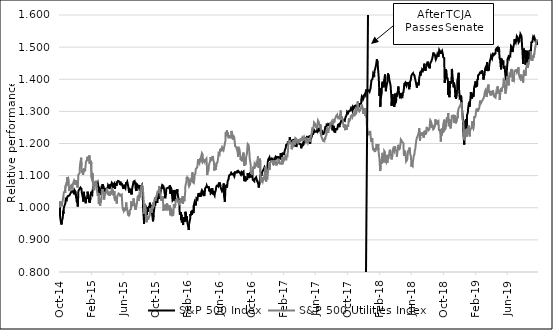
| Category | S&P 500 Index | S&P 500 Utilities Index |
|---|---|---|
| 2014-10-06 | 1 | 1 |
| 2014-10-07 | 0.985 | 0.999 |
| 2014-10-08 | 1.002 | 1.021 |
| 2014-10-09 | 0.981 | 1.004 |
| 2014-10-10 | 0.97 | 1.009 |
| 2014-10-13 | 0.954 | 1.009 |
| 2014-10-14 | 0.956 | 1.018 |
| 2014-10-15 | 0.948 | 1.005 |
| 2014-10-16 | 0.948 | 1.005 |
| 2014-10-17 | 0.96 | 1.011 |
| 2014-10-20 | 0.969 | 1.025 |
| 2014-10-21 | 0.988 | 1.029 |
| 2014-10-22 | 0.981 | 1.035 |
| 2014-10-23 | 0.993 | 1.037 |
| 2014-10-24 | 1 | 1.047 |
| 2014-10-27 | 0.998 | 1.045 |
| 2014-10-28 | 1.01 | 1.053 |
| 2014-10-29 | 1.009 | 1.046 |
| 2014-10-30 | 1.015 | 1.068 |
| 2014-10-31 | 1.027 | 1.068 |
| 2014-11-03 | 1.027 | 1.076 |
| 2014-11-04 | 1.024 | 1.069 |
| 2014-11-05 | 1.03 | 1.094 |
| 2014-11-06 | 1.034 | 1.074 |
| 2014-11-07 | 1.034 | 1.085 |
| 2014-11-10 | 1.037 | 1.091 |
| 2014-11-11 | 1.038 | 1.087 |
| 2014-11-12 | 1.037 | 1.065 |
| 2014-11-13 | 1.038 | 1.056 |
| 2014-11-14 | 1.038 | 1.052 |
| 2014-11-17 | 1.039 | 1.066 |
| 2014-11-18 | 1.044 | 1.069 |
| 2014-11-19 | 1.043 | 1.068 |
| 2014-11-20 | 1.045 | 1.066 |
| 2014-11-21 | 1.05 | 1.07 |
| 2014-11-24 | 1.053 | 1.06 |
| 2014-11-25 | 1.052 | 1.059 |
| 2014-11-26 | 1.055 | 1.065 |
| 2014-11-27 | 1.055 | 1.065 |
| 2014-11-28 | 1.052 | 1.076 |
| 2014-12-01 | 1.045 | 1.078 |
| 2014-12-02 | 1.052 | 1.085 |
| 2014-12-03 | 1.056 | 1.082 |
| 2014-12-04 | 1.055 | 1.081 |
| 2014-12-05 | 1.056 | 1.072 |
| 2014-12-08 | 1.049 | 1.08 |
| 2014-12-09 | 1.048 | 1.085 |
| 2014-12-10 | 1.031 | 1.072 |
| 2014-12-11 | 1.036 | 1.083 |
| 2014-12-12 | 1.019 | 1.072 |
| 2014-12-15 | 1.013 | 1.063 |
| 2014-12-16 | 1.004 | 1.061 |
| 2014-12-17 | 1.024 | 1.081 |
| 2014-12-18 | 1.049 | 1.102 |
| 2014-12-19 | 1.054 | 1.103 |
| 2014-12-22 | 1.058 | 1.106 |
| 2014-12-23 | 1.06 | 1.109 |
| 2014-12-24 | 1.06 | 1.129 |
| 2014-12-25 | 1.06 | 1.129 |
| 2014-12-26 | 1.063 | 1.143 |
| 2014-12-29 | 1.064 | 1.156 |
| 2014-12-30 | 1.059 | 1.132 |
| 2014-12-31 | 1.048 | 1.111 |
| 2015-01-01 | 1.048 | 1.111 |
| 2015-01-02 | 1.048 | 1.117 |
| 2015-01-05 | 1.028 | 1.102 |
| 2015-01-06 | 1.019 | 1.104 |
| 2015-01-07 | 1.031 | 1.115 |
| 2015-01-08 | 1.05 | 1.122 |
| 2015-01-09 | 1.041 | 1.115 |
| 2015-01-12 | 1.032 | 1.112 |
| 2015-01-13 | 1.03 | 1.116 |
| 2015-01-14 | 1.024 | 1.126 |
| 2015-01-15 | 1.014 | 1.134 |
| 2015-01-16 | 1.028 | 1.144 |
| 2015-01-19 | 1.028 | 1.144 |
| 2015-01-20 | 1.029 | 1.147 |
| 2015-01-21 | 1.034 | 1.158 |
| 2015-01-22 | 1.05 | 1.153 |
| 2015-01-23 | 1.044 | 1.157 |
| 2015-01-26 | 1.047 | 1.157 |
| 2015-01-27 | 1.033 | 1.158 |
| 2015-01-28 | 1.019 | 1.148 |
| 2015-01-29 | 1.029 | 1.163 |
| 2015-01-30 | 1.015 | 1.137 |
| 2015-02-02 | 1.029 | 1.142 |
| 2015-02-03 | 1.043 | 1.147 |
| 2015-02-04 | 1.039 | 1.132 |
| 2015-02-05 | 1.05 | 1.142 |
| 2015-02-06 | 1.046 | 1.094 |
| 2015-02-09 | 1.042 | 1.085 |
| 2015-02-10 | 1.053 | 1.107 |
| 2015-02-11 | 1.053 | 1.081 |
| 2015-02-12 | 1.063 | 1.075 |
| 2015-02-13 | 1.067 | 1.058 |
| 2015-02-16 | 1.067 | 1.058 |
| 2015-02-17 | 1.069 | 1.057 |
| 2015-02-18 | 1.069 | 1.082 |
| 2015-02-19 | 1.068 | 1.07 |
| 2015-02-20 | 1.074 | 1.071 |
| 2015-02-23 | 1.074 | 1.078 |
| 2015-02-24 | 1.077 | 1.084 |
| 2015-02-25 | 1.076 | 1.067 |
| 2015-02-26 | 1.074 | 1.059 |
| 2015-02-27 | 1.071 | 1.058 |
| 2015-03-02 | 1.078 | 1.037 |
| 2015-03-03 | 1.073 | 1.044 |
| 2015-03-04 | 1.068 | 1.038 |
| 2015-03-05 | 1.069 | 1.046 |
| 2015-03-06 | 1.054 | 1.014 |
| 2015-03-09 | 1.058 | 1.015 |
| 2015-03-10 | 1.04 | 1.013 |
| 2015-03-11 | 1.038 | 1.006 |
| 2015-03-12 | 1.051 | 1.025 |
| 2015-03-13 | 1.045 | 1.015 |
| 2015-03-16 | 1.059 | 1.032 |
| 2015-03-17 | 1.056 | 1.031 |
| 2015-03-18 | 1.069 | 1.059 |
| 2015-03-19 | 1.063 | 1.048 |
| 2015-03-20 | 1.073 | 1.058 |
| 2015-03-23 | 1.071 | 1.059 |
| 2015-03-24 | 1.064 | 1.047 |
| 2015-03-25 | 1.049 | 1.034 |
| 2015-03-26 | 1.046 | 1.026 |
| 2015-03-27 | 1.049 | 1.031 |
| 2015-03-30 | 1.062 | 1.044 |
| 2015-03-31 | 1.052 | 1.044 |
| 2015-04-01 | 1.048 | 1.045 |
| 2015-04-02 | 1.052 | 1.048 |
| 2015-04-03 | 1.052 | 1.048 |
| 2015-04-06 | 1.059 | 1.061 |
| 2015-04-07 | 1.057 | 1.05 |
| 2015-04-08 | 1.06 | 1.047 |
| 2015-04-09 | 1.064 | 1.042 |
| 2015-04-10 | 1.07 | 1.05 |
| 2015-04-13 | 1.065 | 1.039 |
| 2015-04-14 | 1.067 | 1.045 |
| 2015-04-15 | 1.072 | 1.047 |
| 2015-04-16 | 1.071 | 1.04 |
| 2015-04-17 | 1.059 | 1.037 |
| 2015-04-20 | 1.069 | 1.052 |
| 2015-04-21 | 1.067 | 1.042 |
| 2015-04-22 | 1.073 | 1.045 |
| 2015-04-23 | 1.075 | 1.051 |
| 2015-04-24 | 1.078 | 1.062 |
| 2015-04-27 | 1.073 | 1.048 |
| 2015-04-28 | 1.076 | 1.056 |
| 2015-04-29 | 1.072 | 1.052 |
| 2015-04-30 | 1.061 | 1.039 |
| 2015-05-01 | 1.073 | 1.045 |
| 2015-05-04 | 1.076 | 1.052 |
| 2015-05-05 | 1.063 | 1.028 |
| 2015-05-06 | 1.059 | 1.022 |
| 2015-05-07 | 1.063 | 1.027 |
| 2015-05-08 | 1.077 | 1.034 |
| 2015-05-11 | 1.072 | 1.027 |
| 2015-05-12 | 1.068 | 1.024 |
| 2015-05-13 | 1.068 | 1.013 |
| 2015-05-14 | 1.08 | 1.024 |
| 2015-05-15 | 1.08 | 1.037 |
| 2015-05-18 | 1.084 | 1.041 |
| 2015-05-19 | 1.083 | 1.043 |
| 2015-05-20 | 1.082 | 1.045 |
| 2015-05-21 | 1.084 | 1.044 |
| 2015-05-22 | 1.082 | 1.042 |
| 2015-05-25 | 1.082 | 1.042 |
| 2015-05-26 | 1.071 | 1.035 |
| 2015-05-27 | 1.081 | 1.038 |
| 2015-05-28 | 1.079 | 1.041 |
| 2015-05-29 | 1.073 | 1.039 |
| 2015-06-01 | 1.075 | 1.041 |
| 2015-06-02 | 1.074 | 1.026 |
| 2015-06-03 | 1.076 | 1.012 |
| 2015-06-04 | 1.067 | 1.009 |
| 2015-06-05 | 1.065 | 0.996 |
| 2015-06-08 | 1.058 | 0.99 |
| 2015-06-09 | 1.059 | 0.989 |
| 2015-06-10 | 1.071 | 0.993 |
| 2015-06-11 | 1.073 | 1 |
| 2015-06-12 | 1.066 | 0.991 |
| 2015-06-15 | 1.061 | 0.989 |
| 2015-06-16 | 1.067 | 0.994 |
| 2015-06-17 | 1.069 | 1.003 |
| 2015-06-18 | 1.08 | 1.017 |
| 2015-06-19 | 1.074 | 1.006 |
| 2015-06-22 | 1.08 | 1.005 |
| 2015-06-23 | 1.081 | 0.991 |
| 2015-06-24 | 1.073 | 0.983 |
| 2015-06-25 | 1.07 | 0.976 |
| 2015-06-26 | 1.07 | 0.982 |
| 2015-06-29 | 1.047 | 0.976 |
| 2015-06-30 | 1.05 | 0.974 |
| 2015-07-01 | 1.057 | 0.98 |
| 2015-07-02 | 1.057 | 0.993 |
| 2015-07-03 | 1.057 | 0.993 |
| 2015-07-06 | 1.053 | 0.995 |
| 2015-07-07 | 1.059 | 1.02 |
| 2015-07-08 | 1.042 | 1.015 |
| 2015-07-09 | 1.044 | 1.004 |
| 2015-07-10 | 1.057 | 1.01 |
| 2015-07-13 | 1.069 | 1.01 |
| 2015-07-14 | 1.073 | 1.009 |
| 2015-07-15 | 1.073 | 1.014 |
| 2015-07-16 | 1.081 | 1.029 |
| 2015-07-17 | 1.082 | 1.018 |
| 2015-07-20 | 1.083 | 1.014 |
| 2015-07-21 | 1.079 | 1.004 |
| 2015-07-22 | 1.076 | 1.009 |
| 2015-07-23 | 1.07 | 0.994 |
| 2015-07-24 | 1.058 | 0.994 |
| 2015-07-27 | 1.052 | 1.007 |
| 2015-07-28 | 1.065 | 1.012 |
| 2015-07-29 | 1.073 | 1.015 |
| 2015-07-30 | 1.073 | 1.022 |
| 2015-07-31 | 1.071 | 1.032 |
| 2015-08-03 | 1.068 | 1.038 |
| 2015-08-04 | 1.065 | 1.021 |
| 2015-08-05 | 1.069 | 1.024 |
| 2015-08-06 | 1.06 | 1.029 |
| 2015-08-07 | 1.057 | 1.042 |
| 2015-08-10 | 1.071 | 1.037 |
| 2015-08-11 | 1.061 | 1.042 |
| 2015-08-12 | 1.062 | 1.058 |
| 2015-08-13 | 1.06 | 1.058 |
| 2015-08-14 | 1.064 | 1.066 |
| 2015-08-17 | 1.07 | 1.071 |
| 2015-08-18 | 1.067 | 1.068 |
| 2015-08-19 | 1.058 | 1.072 |
| 2015-08-20 | 1.036 | 1.066 |
| 2015-08-21 | 1.003 | 1.053 |
| 2015-08-24 | 0.964 | 1.014 |
| 2015-08-25 | 0.951 | 0.982 |
| 2015-08-26 | 0.988 | 0.998 |
| 2015-08-27 | 1.012 | 1.01 |
| 2015-08-28 | 1.012 | 1.007 |
| 2015-08-31 | 1.004 | 0.991 |
| 2015-09-01 | 0.974 | 0.965 |
| 2015-09-02 | 0.992 | 0.965 |
| 2015-09-03 | 0.993 | 0.97 |
| 2015-09-04 | 0.978 | 0.955 |
| 2015-09-07 | 0.978 | 0.955 |
| 2015-09-08 | 1.002 | 0.975 |
| 2015-09-09 | 0.988 | 0.962 |
| 2015-09-10 | 0.994 | 0.961 |
| 2015-09-11 | 0.998 | 0.968 |
| 2015-09-14 | 0.994 | 0.971 |
| 2015-09-15 | 1.007 | 0.976 |
| 2015-09-16 | 1.016 | 0.985 |
| 2015-09-17 | 1.013 | 0.998 |
| 2015-09-18 | 0.997 | 0.992 |
| 2015-09-21 | 1.001 | 0.996 |
| 2015-09-22 | 0.989 | 0.984 |
| 2015-09-23 | 0.987 | 0.986 |
| 2015-09-24 | 0.983 | 0.994 |
| 2015-09-25 | 0.983 | 1.004 |
| 2015-09-28 | 0.958 | 0.998 |
| 2015-09-29 | 0.959 | 0.999 |
| 2015-09-30 | 0.977 | 1.017 |
| 2015-10-01 | 0.979 | 1.005 |
| 2015-10-02 | 0.993 | 1.018 |
| 2015-10-05 | 1.011 | 1.032 |
| 2015-10-06 | 1.008 | 1.024 |
| 2015-10-07 | 1.016 | 1.021 |
| 2015-10-08 | 1.025 | 1.033 |
| 2015-10-09 | 1.025 | 1.029 |
| 2015-10-12 | 1.027 | 1.038 |
| 2015-10-13 | 1.02 | 1.036 |
| 2015-10-14 | 1.015 | 1.036 |
| 2015-10-15 | 1.03 | 1.05 |
| 2015-10-16 | 1.035 | 1.053 |
| 2015-10-19 | 1.035 | 1.053 |
| 2015-10-20 | 1.034 | 1.056 |
| 2015-10-21 | 1.028 | 1.054 |
| 2015-10-22 | 1.045 | 1.067 |
| 2015-10-23 | 1.056 | 1.048 |
| 2015-10-26 | 1.054 | 1.043 |
| 2015-10-27 | 1.051 | 1.04 |
| 2015-10-28 | 1.064 | 1.029 |
| 2015-10-29 | 1.063 | 1.022 |
| 2015-10-30 | 1.058 | 1.027 |
| 2015-11-02 | 1.071 | 1.029 |
| 2015-11-03 | 1.074 | 1.032 |
| 2015-11-04 | 1.07 | 1.036 |
| 2015-11-05 | 1.069 | 1.028 |
| 2015-11-06 | 1.068 | 0.99 |
| 2015-11-09 | 1.058 | 0.993 |
| 2015-11-10 | 1.059 | 1 |
| 2015-11-11 | 1.056 | 1.009 |
| 2015-11-12 | 1.041 | 0.997 |
| 2015-11-13 | 1.03 | 0.994 |
| 2015-11-16 | 1.045 | 1.011 |
| 2015-11-17 | 1.044 | 0.992 |
| 2015-11-18 | 1.06 | 0.999 |
| 2015-11-19 | 1.059 | 1.009 |
| 2015-11-20 | 1.063 | 1.014 |
| 2015-11-23 | 1.062 | 1.004 |
| 2015-11-24 | 1.063 | 1.001 |
| 2015-11-25 | 1.063 | 0.995 |
| 2015-11-26 | 1.063 | 0.995 |
| 2015-11-27 | 1.064 | 0.997 |
| 2015-11-30 | 1.059 | 0.999 |
| 2015-12-01 | 1.07 | 1.007 |
| 2015-12-02 | 1.058 | 0.985 |
| 2015-12-03 | 1.043 | 0.976 |
| 2015-12-04 | 1.065 | 0.991 |
| 2015-12-07 | 1.057 | 0.994 |
| 2015-12-08 | 1.05 | 0.992 |
| 2015-12-09 | 1.042 | 0.992 |
| 2015-12-10 | 1.044 | 0.976 |
| 2015-12-11 | 1.024 | 0.973 |
| 2015-12-14 | 1.029 | 0.978 |
| 2015-12-15 | 1.04 | 0.986 |
| 2015-12-16 | 1.055 | 1.011 |
| 2015-12-17 | 1.039 | 1.013 |
| 2015-12-18 | 1.021 | 1 |
| 2015-12-21 | 1.029 | 1 |
| 2015-12-22 | 1.038 | 1.008 |
| 2015-12-23 | 1.051 | 1.024 |
| 2015-12-24 | 1.049 | 1.023 |
| 2015-12-25 | 1.049 | 1.023 |
| 2015-12-28 | 1.047 | 1.025 |
| 2015-12-29 | 1.058 | 1.03 |
| 2015-12-30 | 1.05 | 1.028 |
| 2015-12-31 | 1.04 | 1.018 |
| 2016-01-01 | 1.04 | 1.018 |
| 2016-01-04 | 1.024 | 1.015 |
| 2016-01-05 | 1.026 | 1.023 |
| 2016-01-06 | 1.013 | 1.021 |
| 2016-01-07 | 0.989 | 1.014 |
| 2016-01-08 | 0.978 | 1.014 |
| 2016-01-11 | 0.979 | 1.02 |
| 2016-01-12 | 0.987 | 1.015 |
| 2016-01-13 | 0.962 | 1.015 |
| 2016-01-14 | 0.978 | 1.03 |
| 2016-01-15 | 0.957 | 1.021 |
| 2016-01-18 | 0.957 | 1.021 |
| 2016-01-19 | 0.958 | 1.036 |
| 2016-01-20 | 0.946 | 1.012 |
| 2016-01-21 | 0.951 | 1.012 |
| 2016-01-22 | 0.971 | 1.03 |
| 2016-01-25 | 0.955 | 1.021 |
| 2016-01-26 | 0.969 | 1.028 |
| 2016-01-27 | 0.958 | 1.03 |
| 2016-01-28 | 0.964 | 1.047 |
| 2016-01-29 | 0.987 | 1.067 |
| 2016-02-01 | 0.987 | 1.079 |
| 2016-02-02 | 0.969 | 1.083 |
| 2016-02-03 | 0.973 | 1.095 |
| 2016-02-04 | 0.975 | 1.091 |
| 2016-02-05 | 0.957 | 1.094 |
| 2016-02-08 | 0.943 | 1.09 |
| 2016-02-09 | 0.943 | 1.094 |
| 2016-02-10 | 0.943 | 1.091 |
| 2016-02-11 | 0.931 | 1.07 |
| 2016-02-12 | 0.949 | 1.067 |
| 2016-02-15 | 0.949 | 1.067 |
| 2016-02-16 | 0.965 | 1.073 |
| 2016-02-17 | 0.981 | 1.071 |
| 2016-02-18 | 0.976 | 1.088 |
| 2016-02-19 | 0.976 | 1.081 |
| 2016-02-22 | 0.99 | 1.093 |
| 2016-02-23 | 0.978 | 1.094 |
| 2016-02-24 | 0.982 | 1.099 |
| 2016-02-25 | 0.993 | 1.11 |
| 2016-02-26 | 0.991 | 1.08 |
| 2016-02-29 | 0.983 | 1.082 |
| 2016-03-01 | 1.007 | 1.077 |
| 2016-03-02 | 1.011 | 1.082 |
| 2016-03-03 | 1.015 | 1.088 |
| 2016-03-04 | 1.018 | 1.101 |
| 2016-03-07 | 1.019 | 1.107 |
| 2016-03-08 | 1.007 | 1.116 |
| 2016-03-09 | 1.012 | 1.122 |
| 2016-03-10 | 1.013 | 1.123 |
| 2016-03-11 | 1.029 | 1.124 |
| 2016-03-14 | 1.028 | 1.125 |
| 2016-03-15 | 1.026 | 1.128 |
| 2016-03-16 | 1.032 | 1.139 |
| 2016-03-17 | 1.039 | 1.151 |
| 2016-03-18 | 1.043 | 1.144 |
| 2016-03-21 | 1.044 | 1.142 |
| 2016-03-22 | 1.043 | 1.138 |
| 2016-03-23 | 1.037 | 1.146 |
| 2016-03-24 | 1.036 | 1.15 |
| 2016-03-25 | 1.036 | 1.15 |
| 2016-03-28 | 1.037 | 1.146 |
| 2016-03-29 | 1.046 | 1.162 |
| 2016-03-30 | 1.05 | 1.159 |
| 2016-03-31 | 1.048 | 1.165 |
| 2016-04-01 | 1.055 | 1.17 |
| 2016-04-04 | 1.052 | 1.165 |
| 2016-04-05 | 1.041 | 1.143 |
| 2016-04-06 | 1.052 | 1.142 |
| 2016-04-07 | 1.039 | 1.141 |
| 2016-04-08 | 1.042 | 1.147 |
| 2016-04-11 | 1.039 | 1.142 |
| 2016-04-12 | 1.049 | 1.15 |
| 2016-04-13 | 1.06 | 1.143 |
| 2016-04-14 | 1.06 | 1.141 |
| 2016-04-15 | 1.059 | 1.149 |
| 2016-04-18 | 1.066 | 1.153 |
| 2016-04-19 | 1.069 | 1.154 |
| 2016-04-20 | 1.07 | 1.126 |
| 2016-04-21 | 1.064 | 1.102 |
| 2016-04-22 | 1.065 | 1.112 |
| 2016-04-25 | 1.063 | 1.114 |
| 2016-04-26 | 1.065 | 1.116 |
| 2016-04-27 | 1.066 | 1.131 |
| 2016-04-28 | 1.056 | 1.13 |
| 2016-04-29 | 1.051 | 1.137 |
| 2016-05-02 | 1.059 | 1.146 |
| 2016-05-03 | 1.05 | 1.146 |
| 2016-05-04 | 1.044 | 1.158 |
| 2016-05-05 | 1.044 | 1.154 |
| 2016-05-06 | 1.047 | 1.146 |
| 2016-05-09 | 1.048 | 1.152 |
| 2016-05-10 | 1.061 | 1.153 |
| 2016-05-11 | 1.051 | 1.156 |
| 2016-05-12 | 1.051 | 1.161 |
| 2016-05-13 | 1.042 | 1.156 |
| 2016-05-16 | 1.052 | 1.157 |
| 2016-05-17 | 1.042 | 1.138 |
| 2016-05-18 | 1.042 | 1.116 |
| 2016-05-19 | 1.038 | 1.126 |
| 2016-05-20 | 1.045 | 1.129 |
| 2016-05-23 | 1.042 | 1.118 |
| 2016-05-24 | 1.057 | 1.13 |
| 2016-05-25 | 1.064 | 1.127 |
| 2016-05-26 | 1.064 | 1.139 |
| 2016-05-27 | 1.068 | 1.141 |
| 2016-05-30 | 1.068 | 1.141 |
| 2016-05-31 | 1.067 | 1.148 |
| 2016-06-01 | 1.068 | 1.151 |
| 2016-06-02 | 1.071 | 1.151 |
| 2016-06-03 | 1.068 | 1.17 |
| 2016-06-06 | 1.074 | 1.168 |
| 2016-06-07 | 1.075 | 1.166 |
| 2016-06-08 | 1.079 | 1.173 |
| 2016-06-09 | 1.077 | 1.183 |
| 2016-06-10 | 1.067 | 1.18 |
| 2016-06-13 | 1.058 | 1.178 |
| 2016-06-14 | 1.056 | 1.184 |
| 2016-06-15 | 1.054 | 1.176 |
| 2016-06-16 | 1.058 | 1.184 |
| 2016-06-17 | 1.054 | 1.188 |
| 2016-06-20 | 1.06 | 1.183 |
| 2016-06-21 | 1.063 | 1.185 |
| 2016-06-22 | 1.061 | 1.18 |
| 2016-06-23 | 1.076 | 1.184 |
| 2016-06-24 | 1.037 | 1.185 |
| 2016-06-27 | 1.018 | 1.2 |
| 2016-06-28 | 1.036 | 1.204 |
| 2016-06-29 | 1.054 | 1.207 |
| 2016-06-30 | 1.068 | 1.234 |
| 2016-07-01 | 1.07 | 1.233 |
| 2016-07-04 | 1.07 | 1.233 |
| 2016-07-05 | 1.063 | 1.242 |
| 2016-07-06 | 1.069 | 1.245 |
| 2016-07-07 | 1.068 | 1.222 |
| 2016-07-08 | 1.084 | 1.234 |
| 2016-07-11 | 1.088 | 1.233 |
| 2016-07-12 | 1.095 | 1.216 |
| 2016-07-13 | 1.095 | 1.226 |
| 2016-07-14 | 1.101 | 1.218 |
| 2016-07-15 | 1.1 | 1.221 |
| 2016-07-18 | 1.103 | 1.224 |
| 2016-07-19 | 1.101 | 1.222 |
| 2016-07-20 | 1.106 | 1.216 |
| 2016-07-21 | 1.102 | 1.223 |
| 2016-07-22 | 1.107 | 1.239 |
| 2016-07-25 | 1.104 | 1.237 |
| 2016-07-26 | 1.104 | 1.227 |
| 2016-07-27 | 1.103 | 1.212 |
| 2016-07-28 | 1.104 | 1.216 |
| 2016-07-29 | 1.106 | 1.225 |
| 2016-08-01 | 1.105 | 1.224 |
| 2016-08-02 | 1.098 | 1.217 |
| 2016-08-03 | 1.101 | 1.21 |
| 2016-08-04 | 1.102 | 1.208 |
| 2016-08-05 | 1.111 | 1.192 |
| 2016-08-08 | 1.11 | 1.19 |
| 2016-08-09 | 1.11 | 1.189 |
| 2016-08-10 | 1.107 | 1.189 |
| 2016-08-11 | 1.112 | 1.19 |
| 2016-08-12 | 1.112 | 1.191 |
| 2016-08-15 | 1.115 | 1.172 |
| 2016-08-16 | 1.109 | 1.158 |
| 2016-08-17 | 1.111 | 1.176 |
| 2016-08-18 | 1.113 | 1.19 |
| 2016-08-19 | 1.111 | 1.175 |
| 2016-08-22 | 1.111 | 1.179 |
| 2016-08-23 | 1.113 | 1.173 |
| 2016-08-24 | 1.107 | 1.173 |
| 2016-08-25 | 1.106 | 1.174 |
| 2016-08-26 | 1.104 | 1.149 |
| 2016-08-29 | 1.11 | 1.158 |
| 2016-08-30 | 1.108 | 1.146 |
| 2016-08-31 | 1.105 | 1.149 |
| 2016-09-01 | 1.105 | 1.145 |
| 2016-09-02 | 1.11 | 1.159 |
| 2016-09-05 | 1.11 | 1.159 |
| 2016-09-06 | 1.113 | 1.172 |
| 2016-09-07 | 1.113 | 1.17 |
| 2016-09-08 | 1.11 | 1.175 |
| 2016-09-09 | 1.083 | 1.13 |
| 2016-09-12 | 1.099 | 1.15 |
| 2016-09-13 | 1.083 | 1.134 |
| 2016-09-14 | 1.082 | 1.139 |
| 2016-09-15 | 1.093 | 1.147 |
| 2016-09-16 | 1.089 | 1.158 |
| 2016-09-19 | 1.089 | 1.169 |
| 2016-09-20 | 1.089 | 1.167 |
| 2016-09-21 | 1.101 | 1.192 |
| 2016-09-22 | 1.108 | 1.198 |
| 2016-09-23 | 1.102 | 1.197 |
| 2016-09-26 | 1.092 | 1.194 |
| 2016-09-27 | 1.099 | 1.179 |
| 2016-09-28 | 1.105 | 1.176 |
| 2016-09-29 | 1.095 | 1.159 |
| 2016-09-30 | 1.104 | 1.151 |
| 2016-10-03 | 1.1 | 1.135 |
| 2016-10-04 | 1.094 | 1.111 |
| 2016-10-05 | 1.099 | 1.108 |
| 2016-10-06 | 1.1 | 1.108 |
| 2016-10-07 | 1.096 | 1.107 |
| 2016-10-10 | 1.101 | 1.116 |
| 2016-10-11 | 1.087 | 1.103 |
| 2016-10-12 | 1.089 | 1.114 |
| 2016-10-13 | 1.085 | 1.128 |
| 2016-10-14 | 1.086 | 1.122 |
| 2016-10-17 | 1.082 | 1.128 |
| 2016-10-18 | 1.089 | 1.137 |
| 2016-10-19 | 1.091 | 1.135 |
| 2016-10-20 | 1.09 | 1.134 |
| 2016-10-21 | 1.09 | 1.128 |
| 2016-10-24 | 1.095 | 1.132 |
| 2016-10-25 | 1.091 | 1.138 |
| 2016-10-26 | 1.089 | 1.141 |
| 2016-10-27 | 1.086 | 1.135 |
| 2016-10-28 | 1.082 | 1.138 |
| 2016-10-31 | 1.082 | 1.16 |
| 2016-11-01 | 1.075 | 1.14 |
| 2016-11-02 | 1.068 | 1.125 |
| 2016-11-03 | 1.063 | 1.129 |
| 2016-11-04 | 1.061 | 1.125 |
| 2016-11-07 | 1.085 | 1.145 |
| 2016-11-08 | 1.089 | 1.153 |
| 2016-11-09 | 1.101 | 1.11 |
| 2016-11-10 | 1.103 | 1.083 |
| 2016-11-11 | 1.102 | 1.079 |
| 2016-11-14 | 1.101 | 1.076 |
| 2016-11-15 | 1.11 | 1.095 |
| 2016-11-16 | 1.108 | 1.086 |
| 2016-11-17 | 1.113 | 1.085 |
| 2016-11-18 | 1.11 | 1.081 |
| 2016-11-21 | 1.119 | 1.093 |
| 2016-11-22 | 1.121 | 1.096 |
| 2016-11-23 | 1.122 | 1.086 |
| 2016-11-24 | 1.122 | 1.086 |
| 2016-11-25 | 1.126 | 1.102 |
| 2016-11-28 | 1.121 | 1.123 |
| 2016-11-29 | 1.122 | 1.127 |
| 2016-11-30 | 1.119 | 1.091 |
| 2016-12-01 | 1.115 | 1.081 |
| 2016-12-02 | 1.116 | 1.091 |
| 2016-12-05 | 1.122 | 1.093 |
| 2016-12-06 | 1.126 | 1.091 |
| 2016-12-07 | 1.141 | 1.104 |
| 2016-12-08 | 1.143 | 1.107 |
| 2016-12-09 | 1.15 | 1.118 |
| 2016-12-12 | 1.149 | 1.13 |
| 2016-12-13 | 1.156 | 1.141 |
| 2016-12-14 | 1.147 | 1.118 |
| 2016-12-15 | 1.151 | 1.125 |
| 2016-12-16 | 1.149 | 1.139 |
| 2016-12-19 | 1.152 | 1.143 |
| 2016-12-20 | 1.156 | 1.144 |
| 2016-12-21 | 1.153 | 1.14 |
| 2016-12-22 | 1.151 | 1.144 |
| 2016-12-23 | 1.152 | 1.144 |
| 2016-12-26 | 1.152 | 1.144 |
| 2016-12-27 | 1.155 | 1.144 |
| 2016-12-28 | 1.145 | 1.133 |
| 2016-12-29 | 1.145 | 1.147 |
| 2016-12-30 | 1.139 | 1.142 |
| 2017-01-02 | 1.139 | 1.142 |
| 2017-01-03 | 1.149 | 1.138 |
| 2017-01-04 | 1.156 | 1.142 |
| 2017-01-05 | 1.155 | 1.143 |
| 2017-01-06 | 1.159 | 1.147 |
| 2017-01-09 | 1.155 | 1.132 |
| 2017-01-10 | 1.155 | 1.129 |
| 2017-01-11 | 1.158 | 1.14 |
| 2017-01-12 | 1.156 | 1.141 |
| 2017-01-13 | 1.158 | 1.139 |
| 2017-01-16 | 1.158 | 1.139 |
| 2017-01-17 | 1.154 | 1.152 |
| 2017-01-18 | 1.156 | 1.151 |
| 2017-01-19 | 1.152 | 1.141 |
| 2017-01-20 | 1.156 | 1.142 |
| 2017-01-23 | 1.153 | 1.137 |
| 2017-01-24 | 1.16 | 1.137 |
| 2017-01-25 | 1.17 | 1.137 |
| 2017-01-26 | 1.169 | 1.137 |
| 2017-01-27 | 1.168 | 1.137 |
| 2017-01-30 | 1.161 | 1.137 |
| 2017-01-31 | 1.16 | 1.156 |
| 2017-02-01 | 1.16 | 1.136 |
| 2017-02-02 | 1.161 | 1.146 |
| 2017-02-03 | 1.169 | 1.148 |
| 2017-02-06 | 1.167 | 1.146 |
| 2017-02-07 | 1.167 | 1.148 |
| 2017-02-08 | 1.168 | 1.159 |
| 2017-02-09 | 1.175 | 1.149 |
| 2017-02-10 | 1.179 | 1.156 |
| 2017-02-13 | 1.185 | 1.161 |
| 2017-02-14 | 1.19 | 1.152 |
| 2017-02-15 | 1.196 | 1.148 |
| 2017-02-16 | 1.195 | 1.159 |
| 2017-02-17 | 1.197 | 1.159 |
| 2017-02-20 | 1.197 | 1.159 |
| 2017-02-21 | 1.204 | 1.172 |
| 2017-02-22 | 1.203 | 1.177 |
| 2017-02-23 | 1.203 | 1.189 |
| 2017-02-24 | 1.205 | 1.206 |
| 2017-02-27 | 1.206 | 1.199 |
| 2017-02-28 | 1.203 | 1.21 |
| 2017-03-01 | 1.219 | 1.198 |
| 2017-03-02 | 1.212 | 1.207 |
| 2017-03-03 | 1.213 | 1.203 |
| 2017-03-06 | 1.209 | 1.201 |
| 2017-03-07 | 1.205 | 1.201 |
| 2017-03-08 | 1.203 | 1.182 |
| 2017-03-09 | 1.204 | 1.179 |
| 2017-03-10 | 1.208 | 1.189 |
| 2017-03-13 | 1.208 | 1.191 |
| 2017-03-14 | 1.204 | 1.19 |
| 2017-03-15 | 1.214 | 1.21 |
| 2017-03-16 | 1.212 | 1.197 |
| 2017-03-17 | 1.21 | 1.204 |
| 2017-03-20 | 1.208 | 1.196 |
| 2017-03-21 | 1.193 | 1.212 |
| 2017-03-22 | 1.195 | 1.217 |
| 2017-03-23 | 1.194 | 1.214 |
| 2017-03-24 | 1.193 | 1.219 |
| 2017-03-27 | 1.192 | 1.213 |
| 2017-03-28 | 1.2 | 1.214 |
| 2017-03-29 | 1.202 | 1.208 |
| 2017-03-30 | 1.205 | 1.2 |
| 2017-03-31 | 1.203 | 1.204 |
| 2017-04-03 | 1.201 | 1.204 |
| 2017-04-04 | 1.201 | 1.208 |
| 2017-04-05 | 1.198 | 1.214 |
| 2017-04-06 | 1.2 | 1.212 |
| 2017-04-07 | 1.199 | 1.206 |
| 2017-04-10 | 1.2 | 1.208 |
| 2017-04-11 | 1.198 | 1.208 |
| 2017-04-12 | 1.193 | 1.217 |
| 2017-04-13 | 1.185 | 1.213 |
| 2017-04-14 | 1.185 | 1.213 |
| 2017-04-17 | 1.196 | 1.219 |
| 2017-04-18 | 1.192 | 1.221 |
| 2017-04-19 | 1.19 | 1.212 |
| 2017-04-20 | 1.199 | 1.208 |
| 2017-04-21 | 1.195 | 1.214 |
| 2017-04-24 | 1.208 | 1.22 |
| 2017-04-25 | 1.216 | 1.219 |
| 2017-04-26 | 1.215 | 1.214 |
| 2017-04-27 | 1.216 | 1.218 |
| 2017-04-28 | 1.213 | 1.213 |
| 2017-05-01 | 1.216 | 1.205 |
| 2017-05-02 | 1.217 | 1.208 |
| 2017-05-03 | 1.215 | 1.202 |
| 2017-05-04 | 1.216 | 1.207 |
| 2017-05-05 | 1.221 | 1.214 |
| 2017-05-08 | 1.221 | 1.213 |
| 2017-05-09 | 1.22 | 1.202 |
| 2017-05-10 | 1.221 | 1.204 |
| 2017-05-11 | 1.219 | 1.204 |
| 2017-05-12 | 1.217 | 1.21 |
| 2017-05-15 | 1.223 | 1.215 |
| 2017-05-16 | 1.222 | 1.205 |
| 2017-05-17 | 1.2 | 1.208 |
| 2017-05-18 | 1.204 | 1.213 |
| 2017-05-19 | 1.212 | 1.217 |
| 2017-05-22 | 1.218 | 1.228 |
| 2017-05-23 | 1.221 | 1.23 |
| 2017-05-24 | 1.224 | 1.239 |
| 2017-05-25 | 1.229 | 1.247 |
| 2017-05-26 | 1.23 | 1.247 |
| 2017-05-29 | 1.23 | 1.247 |
| 2017-05-30 | 1.228 | 1.251 |
| 2017-05-31 | 1.227 | 1.257 |
| 2017-06-01 | 1.237 | 1.266 |
| 2017-06-02 | 1.241 | 1.267 |
| 2017-06-05 | 1.24 | 1.261 |
| 2017-06-06 | 1.236 | 1.259 |
| 2017-06-07 | 1.238 | 1.263 |
| 2017-06-08 | 1.239 | 1.252 |
| 2017-06-09 | 1.238 | 1.252 |
| 2017-06-12 | 1.236 | 1.249 |
| 2017-06-13 | 1.242 | 1.251 |
| 2017-06-14 | 1.241 | 1.259 |
| 2017-06-15 | 1.238 | 1.266 |
| 2017-06-16 | 1.238 | 1.272 |
| 2017-06-19 | 1.249 | 1.267 |
| 2017-06-20 | 1.24 | 1.268 |
| 2017-06-21 | 1.24 | 1.259 |
| 2017-06-22 | 1.239 | 1.254 |
| 2017-06-23 | 1.241 | 1.249 |
| 2017-06-26 | 1.241 | 1.259 |
| 2017-06-27 | 1.231 | 1.243 |
| 2017-06-28 | 1.242 | 1.232 |
| 2017-06-29 | 1.232 | 1.222 |
| 2017-06-30 | 1.233 | 1.22 |
| 2017-07-03 | 1.236 | 1.213 |
| 2017-07-04 | 1.236 | 1.213 |
| 2017-07-05 | 1.238 | 1.209 |
| 2017-07-06 | 1.226 | 1.207 |
| 2017-07-07 | 1.234 | 1.209 |
| 2017-07-10 | 1.235 | 1.207 |
| 2017-07-11 | 1.234 | 1.206 |
| 2017-07-12 | 1.243 | 1.217 |
| 2017-07-13 | 1.246 | 1.212 |
| 2017-07-14 | 1.252 | 1.219 |
| 2017-07-17 | 1.252 | 1.224 |
| 2017-07-18 | 1.252 | 1.227 |
| 2017-07-19 | 1.259 | 1.233 |
| 2017-07-20 | 1.259 | 1.241 |
| 2017-07-21 | 1.258 | 1.25 |
| 2017-07-24 | 1.257 | 1.239 |
| 2017-07-25 | 1.261 | 1.233 |
| 2017-07-26 | 1.261 | 1.243 |
| 2017-07-27 | 1.26 | 1.246 |
| 2017-07-28 | 1.258 | 1.244 |
| 2017-07-31 | 1.257 | 1.249 |
| 2017-08-01 | 1.26 | 1.255 |
| 2017-08-02 | 1.261 | 1.261 |
| 2017-08-03 | 1.258 | 1.266 |
| 2017-08-04 | 1.261 | 1.263 |
| 2017-08-07 | 1.263 | 1.265 |
| 2017-08-08 | 1.26 | 1.269 |
| 2017-08-09 | 1.259 | 1.263 |
| 2017-08-10 | 1.241 | 1.266 |
| 2017-08-11 | 1.243 | 1.258 |
| 2017-08-14 | 1.255 | 1.265 |
| 2017-08-15 | 1.254 | 1.272 |
| 2017-08-16 | 1.256 | 1.276 |
| 2017-08-17 | 1.237 | 1.266 |
| 2017-08-18 | 1.234 | 1.274 |
| 2017-08-21 | 1.236 | 1.278 |
| 2017-08-22 | 1.248 | 1.281 |
| 2017-08-23 | 1.244 | 1.284 |
| 2017-08-24 | 1.241 | 1.283 |
| 2017-08-25 | 1.243 | 1.287 |
| 2017-08-28 | 1.244 | 1.29 |
| 2017-08-29 | 1.245 | 1.288 |
| 2017-08-30 | 1.251 | 1.282 |
| 2017-08-31 | 1.258 | 1.283 |
| 2017-09-01 | 1.26 | 1.279 |
| 2017-09-04 | 1.26 | 1.279 |
| 2017-09-05 | 1.251 | 1.282 |
| 2017-09-06 | 1.255 | 1.276 |
| 2017-09-07 | 1.255 | 1.285 |
| 2017-09-08 | 1.253 | 1.291 |
| 2017-09-11 | 1.266 | 1.303 |
| 2017-09-12 | 1.271 | 1.28 |
| 2017-09-13 | 1.272 | 1.273 |
| 2017-09-14 | 1.27 | 1.284 |
| 2017-09-15 | 1.272 | 1.285 |
| 2017-09-18 | 1.274 | 1.273 |
| 2017-09-19 | 1.276 | 1.27 |
| 2017-09-20 | 1.277 | 1.26 |
| 2017-09-21 | 1.273 | 1.259 |
| 2017-09-22 | 1.274 | 1.25 |
| 2017-09-25 | 1.271 | 1.261 |
| 2017-09-26 | 1.271 | 1.259 |
| 2017-09-27 | 1.276 | 1.242 |
| 2017-09-28 | 1.278 | 1.245 |
| 2017-09-29 | 1.282 | 1.244 |
| 2017-10-02 | 1.287 | 1.247 |
| 2017-10-03 | 1.29 | 1.242 |
| 2017-10-04 | 1.292 | 1.255 |
| 2017-10-05 | 1.299 | 1.254 |
| 2017-10-06 | 1.297 | 1.253 |
| 2017-10-09 | 1.295 | 1.255 |
| 2017-10-10 | 1.298 | 1.267 |
| 2017-10-11 | 1.3 | 1.273 |
| 2017-10-12 | 1.298 | 1.279 |
| 2017-10-13 | 1.299 | 1.27 |
| 2017-10-16 | 1.302 | 1.267 |
| 2017-10-17 | 1.303 | 1.275 |
| 2017-10-18 | 1.304 | 1.273 |
| 2017-10-19 | 1.304 | 1.286 |
| 2017-10-20 | 1.311 | 1.287 |
| 2017-10-23 | 1.305 | 1.288 |
| 2017-10-24 | 1.308 | 1.289 |
| 2017-10-25 | 1.301 | 1.283 |
| 2017-10-26 | 1.303 | 1.283 |
| 2017-10-27 | 1.314 | 1.291 |
| 2017-10-30 | 1.309 | 1.291 |
| 2017-10-31 | 1.311 | 1.292 |
| 2017-11-01 | 1.313 | 1.285 |
| 2017-11-02 | 1.313 | 1.29 |
| 2017-11-03 | 1.317 | 1.295 |
| 2017-11-06 | 1.319 | 1.289 |
| 2017-11-07 | 1.319 | 1.305 |
| 2017-11-08 | 1.32 | 1.305 |
| 2017-11-09 | 1.315 | 1.306 |
| 2017-11-10 | 1.314 | 1.301 |
| 2017-11-13 | 1.316 | 1.316 |
| 2017-11-14 | 1.313 | 1.331 |
| 2017-11-15 | 1.305 | 1.319 |
| 2017-11-16 | 1.316 | 1.313 |
| 2017-11-17 | 1.313 | 1.304 |
| 2017-11-20 | 1.314 | 1.3 |
| 2017-11-21 | 1.323 | 1.303 |
| 2017-11-22 | 1.322 | 1.302 |
| 2017-11-23 | 1.322 | 1.302 |
| 2017-11-24 | 1.325 | 1.304 |
| 2017-11-27 | 1.324 | 1.31 |
| 2017-11-28 | 1.337 | 1.316 |
| 2017-11-29 | 1.337 | 1.317 |
| 2017-11-30 | 1.347 | 1.321 |
| 2017-12-01 | 1.345 | 1.316 |
| 2017-12-04 | 1.343 | 1.308 |
| 2017-12-05 | 1.338 | 1.292 |
| 2017-12-06 | 1.338 | 1.297 |
| 2017-12-07 | 1.342 | 1.298 |
| 2017-12-08 | 1.349 | 1.302 |
| 2017-12-11 | 1.354 | 1.31 |
| 2017-12-12 | 1.356 | 1.288 |
| 2017-12-13 | 1.355 | 1.291 |
| 2017-12-14 | 1.35 | 1.289 |
| 2017-12-15 | 1.362 | 1.294 |
| 2017-12-18 | 1.369 | 1.279 |
| 2017-12-19 | 1.365 | 1.256 |
| 2017-12-20 | 1.364 | 1.246 |
| 2017-12-21 | 1.366 | 1.231 |
| 2017-12-22 | 1.366 | 1.233 |
| 2017-12-25 | 1.366 | 1.233 |
| 2017-12-26 | 1.364 | 1.226 |
| 2017-12-27 | 1.365 | 1.231 |
| 2017-12-28 | 1.368 | 1.237 |
| 2017-12-29 | 1.361 | 1.237 |
| 2018-01-01 | 1.361 | 1.237 |
| 2018-01-02 | 1.372 | 1.226 |
| 2018-01-03 | 1.381 | 1.217 |
| 2018-01-04 | 1.386 | 1.206 |
| 2018-01-05 | 1.396 | 1.206 |
| 2018-01-08 | 1.398 | 1.217 |
| 2018-01-09 | 1.4 | 1.205 |
| 2018-01-10 | 1.399 | 1.191 |
| 2018-01-11 | 1.409 | 1.187 |
| 2018-01-12 | 1.418 | 1.181 |
| 2018-01-15 | 1.418 | 1.181 |
| 2018-01-16 | 1.413 | 1.178 |
| 2018-01-17 | 1.426 | 1.185 |
| 2018-01-18 | 1.424 | 1.178 |
| 2018-01-19 | 1.43 | 1.174 |
| 2018-01-22 | 1.442 | 1.176 |
| 2018-01-23 | 1.445 | 1.187 |
| 2018-01-24 | 1.444 | 1.18 |
| 2018-01-25 | 1.445 | 1.198 |
| 2018-01-26 | 1.462 | 1.199 |
| 2018-01-29 | 1.452 | 1.183 |
| 2018-01-30 | 1.436 | 1.185 |
| 2018-01-31 | 1.437 | 1.198 |
| 2018-02-01 | 1.436 | 1.179 |
| 2018-02-02 | 1.406 | 1.171 |
| 2018-02-05 | 1.348 | 1.151 |
| 2018-02-06 | 1.372 | 1.134 |
| 2018-02-07 | 1.365 | 1.128 |
| 2018-02-08 | 1.314 | 1.114 |
| 2018-02-09 | 1.333 | 1.138 |
| 2018-02-12 | 1.352 | 1.148 |
| 2018-02-13 | 1.355 | 1.152 |
| 2018-02-14 | 1.373 | 1.138 |
| 2018-02-15 | 1.39 | 1.162 |
| 2018-02-16 | 1.391 | 1.171 |
| 2018-02-19 | 1.391 | 1.171 |
| 2018-02-20 | 1.382 | 1.156 |
| 2018-02-21 | 1.375 | 1.141 |
| 2018-02-22 | 1.376 | 1.146 |
| 2018-02-23 | 1.398 | 1.177 |
| 2018-02-26 | 1.415 | 1.173 |
| 2018-02-27 | 1.397 | 1.153 |
| 2018-02-28 | 1.381 | 1.146 |
| 2018-03-01 | 1.363 | 1.145 |
| 2018-03-02 | 1.37 | 1.142 |
| 2018-03-05 | 1.385 | 1.165 |
| 2018-03-06 | 1.388 | 1.149 |
| 2018-03-07 | 1.388 | 1.14 |
| 2018-03-08 | 1.394 | 1.148 |
| 2018-03-09 | 1.418 | 1.151 |
| 2018-03-12 | 1.416 | 1.156 |
| 2018-03-13 | 1.407 | 1.158 |
| 2018-03-14 | 1.399 | 1.17 |
| 2018-03-15 | 1.398 | 1.169 |
| 2018-03-16 | 1.401 | 1.181 |
| 2018-03-19 | 1.381 | 1.172 |
| 2018-03-20 | 1.383 | 1.166 |
| 2018-03-21 | 1.38 | 1.162 |
| 2018-03-22 | 1.346 | 1.167 |
| 2018-03-23 | 1.317 | 1.151 |
| 2018-03-26 | 1.353 | 1.163 |
| 2018-03-27 | 1.33 | 1.18 |
| 2018-03-28 | 1.326 | 1.179 |
| 2018-03-29 | 1.344 | 1.185 |
| 2018-03-30 | 1.344 | 1.185 |
| 2018-04-02 | 1.314 | 1.176 |
| 2018-04-03 | 1.331 | 1.18 |
| 2018-04-04 | 1.346 | 1.182 |
| 2018-04-05 | 1.355 | 1.192 |
| 2018-04-06 | 1.326 | 1.183 |
| 2018-04-09 | 1.33 | 1.185 |
| 2018-04-10 | 1.352 | 1.176 |
| 2018-04-11 | 1.345 | 1.174 |
| 2018-04-12 | 1.356 | 1.159 |
| 2018-04-13 | 1.352 | 1.167 |
| 2018-04-16 | 1.363 | 1.183 |
| 2018-04-17 | 1.377 | 1.196 |
| 2018-04-18 | 1.379 | 1.191 |
| 2018-04-19 | 1.371 | 1.19 |
| 2018-04-20 | 1.359 | 1.18 |
| 2018-04-23 | 1.359 | 1.181 |
| 2018-04-24 | 1.341 | 1.188 |
| 2018-04-25 | 1.343 | 1.189 |
| 2018-04-26 | 1.357 | 1.201 |
| 2018-04-27 | 1.359 | 1.212 |
| 2018-04-30 | 1.348 | 1.209 |
| 2018-05-01 | 1.351 | 1.206 |
| 2018-05-02 | 1.341 | 1.204 |
| 2018-05-03 | 1.338 | 1.203 |
| 2018-05-04 | 1.356 | 1.207 |
| 2018-05-07 | 1.36 | 1.201 |
| 2018-05-08 | 1.36 | 1.171 |
| 2018-05-09 | 1.373 | 1.162 |
| 2018-05-10 | 1.386 | 1.178 |
| 2018-05-11 | 1.388 | 1.18 |
| 2018-05-14 | 1.39 | 1.175 |
| 2018-05-15 | 1.38 | 1.164 |
| 2018-05-16 | 1.386 | 1.154 |
| 2018-05-17 | 1.384 | 1.144 |
| 2018-05-18 | 1.381 | 1.143 |
| 2018-05-21 | 1.391 | 1.149 |
| 2018-05-22 | 1.387 | 1.154 |
| 2018-05-23 | 1.391 | 1.164 |
| 2018-05-24 | 1.388 | 1.173 |
| 2018-05-25 | 1.385 | 1.178 |
| 2018-05-28 | 1.385 | 1.178 |
| 2018-05-29 | 1.369 | 1.178 |
| 2018-05-30 | 1.386 | 1.187 |
| 2018-05-31 | 1.377 | 1.189 |
| 2018-06-01 | 1.392 | 1.17 |
| 2018-06-04 | 1.398 | 1.16 |
| 2018-06-05 | 1.399 | 1.153 |
| 2018-06-06 | 1.411 | 1.128 |
| 2018-06-07 | 1.41 | 1.133 |
| 2018-06-08 | 1.414 | 1.133 |
| 2018-06-11 | 1.416 | 1.129 |
| 2018-06-12 | 1.418 | 1.144 |
| 2018-06-13 | 1.413 | 1.141 |
| 2018-06-14 | 1.416 | 1.154 |
| 2018-06-15 | 1.415 | 1.162 |
| 2018-06-18 | 1.412 | 1.166 |
| 2018-06-19 | 1.406 | 1.178 |
| 2018-06-20 | 1.408 | 1.178 |
| 2018-06-21 | 1.399 | 1.182 |
| 2018-06-22 | 1.402 | 1.191 |
| 2018-06-25 | 1.383 | 1.211 |
| 2018-06-26 | 1.386 | 1.211 |
| 2018-06-27 | 1.374 | 1.218 |
| 2018-06-28 | 1.382 | 1.217 |
| 2018-06-29 | 1.384 | 1.218 |
| 2018-07-02 | 1.388 | 1.228 |
| 2018-07-03 | 1.381 | 1.231 |
| 2018-07-04 | 1.381 | 1.231 |
| 2018-07-05 | 1.393 | 1.238 |
| 2018-07-06 | 1.405 | 1.248 |
| 2018-07-09 | 1.417 | 1.209 |
| 2018-07-10 | 1.422 | 1.22 |
| 2018-07-11 | 1.412 | 1.231 |
| 2018-07-12 | 1.424 | 1.232 |
| 2018-07-13 | 1.426 | 1.233 |
| 2018-07-16 | 1.424 | 1.231 |
| 2018-07-17 | 1.43 | 1.23 |
| 2018-07-18 | 1.433 | 1.224 |
| 2018-07-19 | 1.427 | 1.235 |
| 2018-07-20 | 1.426 | 1.226 |
| 2018-07-23 | 1.429 | 1.218 |
| 2018-07-24 | 1.435 | 1.222 |
| 2018-07-25 | 1.449 | 1.226 |
| 2018-07-26 | 1.444 | 1.24 |
| 2018-07-27 | 1.435 | 1.234 |
| 2018-07-30 | 1.426 | 1.227 |
| 2018-07-31 | 1.433 | 1.24 |
| 2018-08-01 | 1.432 | 1.23 |
| 2018-08-02 | 1.439 | 1.236 |
| 2018-08-03 | 1.446 | 1.249 |
| 2018-08-06 | 1.451 | 1.251 |
| 2018-08-07 | 1.455 | 1.248 |
| 2018-08-08 | 1.454 | 1.241 |
| 2018-08-09 | 1.452 | 1.246 |
| 2018-08-10 | 1.442 | 1.241 |
| 2018-08-13 | 1.436 | 1.242 |
| 2018-08-14 | 1.445 | 1.244 |
| 2018-08-15 | 1.434 | 1.254 |
| 2018-08-16 | 1.446 | 1.268 |
| 2018-08-17 | 1.451 | 1.273 |
| 2018-08-20 | 1.454 | 1.268 |
| 2018-08-21 | 1.457 | 1.259 |
| 2018-08-22 | 1.457 | 1.249 |
| 2018-08-23 | 1.454 | 1.249 |
| 2018-08-24 | 1.463 | 1.255 |
| 2018-08-27 | 1.474 | 1.247 |
| 2018-08-28 | 1.475 | 1.244 |
| 2018-08-29 | 1.483 | 1.251 |
| 2018-08-30 | 1.477 | 1.253 |
| 2018-08-31 | 1.477 | 1.247 |
| 2018-09-03 | 1.477 | 1.247 |
| 2018-09-04 | 1.474 | 1.254 |
| 2018-09-05 | 1.47 | 1.27 |
| 2018-09-06 | 1.465 | 1.275 |
| 2018-09-07 | 1.462 | 1.26 |
| 2018-09-10 | 1.464 | 1.267 |
| 2018-09-11 | 1.47 | 1.263 |
| 2018-09-12 | 1.47 | 1.262 |
| 2018-09-13 | 1.478 | 1.271 |
| 2018-09-14 | 1.478 | 1.265 |
| 2018-09-17 | 1.47 | 1.268 |
| 2018-09-18 | 1.478 | 1.266 |
| 2018-09-19 | 1.48 | 1.239 |
| 2018-09-20 | 1.492 | 1.24 |
| 2018-09-21 | 1.491 | 1.245 |
| 2018-09-24 | 1.486 | 1.234 |
| 2018-09-25 | 1.484 | 1.219 |
| 2018-09-26 | 1.479 | 1.206 |
| 2018-09-27 | 1.483 | 1.218 |
| 2018-09-28 | 1.483 | 1.236 |
| 2018-10-01 | 1.488 | 1.233 |
| 2018-10-02 | 1.488 | 1.248 |
| 2018-10-03 | 1.489 | 1.233 |
| 2018-10-04 | 1.477 | 1.24 |
| 2018-10-05 | 1.469 | 1.259 |
| 2018-10-08 | 1.468 | 1.269 |
| 2018-10-09 | 1.466 | 1.274 |
| 2018-10-10 | 1.418 | 1.267 |
| 2018-10-11 | 1.389 | 1.243 |
| 2018-10-12 | 1.408 | 1.243 |
| 2018-10-15 | 1.4 | 1.248 |
| 2018-10-16 | 1.43 | 1.262 |
| 2018-10-17 | 1.43 | 1.26 |
| 2018-10-18 | 1.409 | 1.261 |
| 2018-10-19 | 1.409 | 1.281 |
| 2018-10-22 | 1.403 | 1.272 |
| 2018-10-23 | 1.395 | 1.266 |
| 2018-10-24 | 1.352 | 1.295 |
| 2018-10-25 | 1.377 | 1.276 |
| 2018-10-26 | 1.353 | 1.254 |
| 2018-10-29 | 1.344 | 1.271 |
| 2018-10-30 | 1.365 | 1.275 |
| 2018-10-31 | 1.38 | 1.26 |
| 2018-11-01 | 1.395 | 1.253 |
| 2018-11-02 | 1.386 | 1.247 |
| 2018-11-05 | 1.394 | 1.264 |
| 2018-11-06 | 1.402 | 1.274 |
| 2018-11-07 | 1.432 | 1.288 |
| 2018-11-08 | 1.429 | 1.284 |
| 2018-11-09 | 1.415 | 1.285 |
| 2018-11-12 | 1.388 | 1.285 |
| 2018-11-13 | 1.385 | 1.289 |
| 2018-11-14 | 1.375 | 1.275 |
| 2018-11-15 | 1.39 | 1.265 |
| 2018-11-16 | 1.393 | 1.282 |
| 2018-11-19 | 1.369 | 1.288 |
| 2018-11-20 | 1.345 | 1.282 |
| 2018-11-21 | 1.349 | 1.263 |
| 2018-11-22 | 1.349 | 1.263 |
| 2018-11-23 | 1.34 | 1.264 |
| 2018-11-26 | 1.361 | 1.271 |
| 2018-11-27 | 1.365 | 1.282 |
| 2018-11-28 | 1.396 | 1.281 |
| 2018-11-29 | 1.393 | 1.279 |
| 2018-11-30 | 1.405 | 1.298 |
| 2018-12-03 | 1.42 | 1.31 |
| 2018-12-04 | 1.374 | 1.312 |
| 2018-12-05 | 1.374 | 1.312 |
| 2018-12-06 | 1.372 | 1.31 |
| 2018-12-07 | 1.34 | 1.316 |
| 2018-12-10 | 1.342 | 1.32 |
| 2018-12-11 | 1.342 | 1.324 |
| 2018-12-12 | 1.349 | 1.316 |
| 2018-12-13 | 1.349 | 1.328 |
| 2018-12-14 | 1.323 | 1.324 |
| 2018-12-17 | 1.296 | 1.281 |
| 2018-12-18 | 1.296 | 1.273 |
| 2018-12-19 | 1.276 | 1.27 |
| 2018-12-20 | 1.256 | 1.273 |
| 2018-12-21 | 1.23 | 1.264 |
| 2018-12-24 | 1.197 | 1.21 |
| 2018-12-25 | 1.197 | 1.21 |
| 2018-12-26 | 1.256 | 1.229 |
| 2018-12-27 | 1.267 | 1.24 |
| 2018-12-28 | 1.265 | 1.24 |
| 2018-12-31 | 1.276 | 1.242 |
| 2019-01-01 | 1.276 | 1.242 |
| 2019-01-02 | 1.277 | 1.22 |
| 2019-01-03 | 1.246 | 1.221 |
| 2019-01-04 | 1.289 | 1.24 |
| 2019-01-07 | 1.298 | 1.231 |
| 2019-01-08 | 1.31 | 1.246 |
| 2019-01-09 | 1.316 | 1.238 |
| 2019-01-10 | 1.322 | 1.256 |
| 2019-01-11 | 1.321 | 1.25 |
| 2019-01-14 | 1.314 | 1.222 |
| 2019-01-15 | 1.329 | 1.238 |
| 2019-01-16 | 1.331 | 1.241 |
| 2019-01-17 | 1.342 | 1.246 |
| 2019-01-18 | 1.359 | 1.248 |
| 2019-01-21 | 1.359 | 1.248 |
| 2019-01-22 | 1.34 | 1.25 |
| 2019-01-23 | 1.343 | 1.263 |
| 2019-01-24 | 1.345 | 1.269 |
| 2019-01-25 | 1.356 | 1.252 |
| 2019-01-28 | 1.346 | 1.247 |
| 2019-01-29 | 1.344 | 1.25 |
| 2019-01-30 | 1.365 | 1.258 |
| 2019-01-31 | 1.376 | 1.284 |
| 2019-02-01 | 1.377 | 1.28 |
| 2019-02-04 | 1.387 | 1.283 |
| 2019-02-05 | 1.393 | 1.285 |
| 2019-02-06 | 1.39 | 1.283 |
| 2019-02-07 | 1.377 | 1.3 |
| 2019-02-08 | 1.378 | 1.306 |
| 2019-02-11 | 1.379 | 1.305 |
| 2019-02-12 | 1.397 | 1.307 |
| 2019-02-13 | 1.401 | 1.303 |
| 2019-02-14 | 1.397 | 1.299 |
| 2019-02-15 | 1.413 | 1.303 |
| 2019-02-18 | 1.413 | 1.303 |
| 2019-02-19 | 1.415 | 1.31 |
| 2019-02-20 | 1.417 | 1.316 |
| 2019-02-21 | 1.412 | 1.326 |
| 2019-02-22 | 1.421 | 1.334 |
| 2019-02-25 | 1.423 | 1.325 |
| 2019-02-26 | 1.422 | 1.323 |
| 2019-02-27 | 1.421 | 1.325 |
| 2019-02-28 | 1.417 | 1.33 |
| 2019-03-01 | 1.427 | 1.332 |
| 2019-03-04 | 1.421 | 1.335 |
| 2019-03-05 | 1.42 | 1.333 |
| 2019-03-06 | 1.411 | 1.333 |
| 2019-03-07 | 1.399 | 1.337 |
| 2019-03-08 | 1.396 | 1.342 |
| 2019-03-11 | 1.417 | 1.352 |
| 2019-03-12 | 1.421 | 1.36 |
| 2019-03-13 | 1.431 | 1.362 |
| 2019-03-14 | 1.429 | 1.36 |
| 2019-03-15 | 1.437 | 1.366 |
| 2019-03-18 | 1.442 | 1.361 |
| 2019-03-19 | 1.442 | 1.345 |
| 2019-03-20 | 1.437 | 1.349 |
| 2019-03-21 | 1.453 | 1.363 |
| 2019-03-22 | 1.425 | 1.372 |
| 2019-03-25 | 1.424 | 1.374 |
| 2019-03-26 | 1.434 | 1.383 |
| 2019-03-27 | 1.428 | 1.374 |
| 2019-03-28 | 1.433 | 1.357 |
| 2019-03-29 | 1.443 | 1.365 |
| 2019-04-01 | 1.459 | 1.355 |
| 2019-04-02 | 1.459 | 1.357 |
| 2019-04-03 | 1.462 | 1.355 |
| 2019-04-04 | 1.465 | 1.35 |
| 2019-04-05 | 1.472 | 1.363 |
| 2019-04-08 | 1.474 | 1.353 |
| 2019-04-09 | 1.465 | 1.357 |
| 2019-04-10 | 1.47 | 1.352 |
| 2019-04-11 | 1.47 | 1.359 |
| 2019-04-12 | 1.48 | 1.366 |
| 2019-04-15 | 1.479 | 1.366 |
| 2019-04-16 | 1.48 | 1.347 |
| 2019-04-17 | 1.476 | 1.344 |
| 2019-04-18 | 1.479 | 1.344 |
| 2019-04-19 | 1.479 | 1.344 |
| 2019-04-22 | 1.48 | 1.343 |
| 2019-04-23 | 1.493 | 1.348 |
| 2019-04-24 | 1.49 | 1.355 |
| 2019-04-25 | 1.489 | 1.361 |
| 2019-04-26 | 1.496 | 1.363 |
| 2019-04-29 | 1.498 | 1.355 |
| 2019-04-30 | 1.499 | 1.377 |
| 2019-05-01 | 1.488 | 1.363 |
| 2019-05-02 | 1.485 | 1.359 |
| 2019-05-03 | 1.499 | 1.367 |
| 2019-05-06 | 1.492 | 1.359 |
| 2019-05-07 | 1.468 | 1.354 |
| 2019-05-08 | 1.465 | 1.336 |
| 2019-05-09 | 1.461 | 1.335 |
| 2019-05-10 | 1.466 | 1.358 |
| 2019-05-13 | 1.431 | 1.373 |
| 2019-05-14 | 1.443 | 1.361 |
| 2019-05-15 | 1.451 | 1.359 |
| 2019-05-16 | 1.464 | 1.367 |
| 2019-05-17 | 1.455 | 1.374 |
| 2019-05-20 | 1.446 | 1.376 |
| 2019-05-21 | 1.458 | 1.377 |
| 2019-05-22 | 1.454 | 1.388 |
| 2019-05-23 | 1.436 | 1.399 |
| 2019-05-24 | 1.438 | 1.396 |
| 2019-05-27 | 1.438 | 1.396 |
| 2019-05-28 | 1.426 | 1.374 |
| 2019-05-29 | 1.416 | 1.355 |
| 2019-05-30 | 1.419 | 1.354 |
| 2019-05-31 | 1.401 | 1.36 |
| 2019-06-03 | 1.397 | 1.374 |
| 2019-06-04 | 1.427 | 1.374 |
| 2019-06-05 | 1.438 | 1.404 |
| 2019-06-06 | 1.447 | 1.41 |
| 2019-06-07 | 1.462 | 1.399 |
| 2019-06-10 | 1.469 | 1.391 |
| 2019-06-11 | 1.469 | 1.381 |
| 2019-06-12 | 1.466 | 1.399 |
| 2019-06-13 | 1.472 | 1.401 |
| 2019-06-14 | 1.469 | 1.415 |
| 2019-06-17 | 1.471 | 1.411 |
| 2019-06-18 | 1.485 | 1.406 |
| 2019-06-19 | 1.489 | 1.418 |
| 2019-06-20 | 1.504 | 1.425 |
| 2019-06-21 | 1.502 | 1.432 |
| 2019-06-24 | 1.499 | 1.432 |
| 2019-06-25 | 1.485 | 1.423 |
| 2019-06-26 | 1.483 | 1.393 |
| 2019-06-27 | 1.489 | 1.394 |
| 2019-06-28 | 1.497 | 1.402 |
| 2019-07-01 | 1.509 | 1.397 |
| 2019-07-02 | 1.513 | 1.415 |
| 2019-07-03 | 1.525 | 1.427 |
| 2019-07-04 | 1.525 | 1.427 |
| 2019-07-05 | 1.522 | 1.424 |
| 2019-07-08 | 1.515 | 1.426 |
| 2019-07-09 | 1.516 | 1.427 |
| 2019-07-10 | 1.523 | 1.431 |
| 2019-07-11 | 1.527 | 1.432 |
| 2019-07-12 | 1.534 | 1.423 |
| 2019-07-15 | 1.534 | 1.428 |
| 2019-07-16 | 1.529 | 1.42 |
| 2019-07-17 | 1.519 | 1.426 |
| 2019-07-18 | 1.524 | 1.437 |
| 2019-07-19 | 1.515 | 1.416 |
| 2019-07-22 | 1.519 | 1.414 |
| 2019-07-23 | 1.53 | 1.405 |
| 2019-07-24 | 1.537 | 1.406 |
| 2019-07-25 | 1.529 | 1.402 |
| 2019-07-26 | 1.54 | 1.408 |
| 2019-07-29 | 1.538 | 1.415 |
| 2019-07-30 | 1.534 | 1.404 |
| 2019-07-31 | 1.517 | 1.396 |
| 2019-08-01 | 1.503 | 1.41 |
| 2019-08-02 | 1.492 | 1.411 |
| 2019-08-05 | 1.448 | 1.39 |
| 2019-08-06 | 1.467 | 1.408 |
| 2019-08-07 | 1.468 | 1.411 |
| 2019-08-08 | 1.495 | 1.425 |
| 2019-08-09 | 1.485 | 1.426 |
| 2019-08-12 | 1.468 | 1.423 |
| 2019-08-13 | 1.489 | 1.424 |
| 2019-08-14 | 1.446 | 1.411 |
| 2019-08-15 | 1.449 | 1.428 |
| 2019-08-16 | 1.47 | 1.434 |
| 2019-08-19 | 1.488 | 1.443 |
| 2019-08-20 | 1.476 | 1.441 |
| 2019-08-21 | 1.488 | 1.451 |
| 2019-08-22 | 1.488 | 1.452 |
| 2019-08-23 | 1.449 | 1.436 |
| 2019-08-26 | 1.465 | 1.453 |
| 2019-08-27 | 1.46 | 1.455 |
| 2019-08-28 | 1.47 | 1.451 |
| 2019-08-29 | 1.488 | 1.461 |
| 2019-08-30 | 1.489 | 1.461 |
| 2019-09-02 | 1.489 | 1.461 |
| 2019-09-03 | 1.479 | 1.487 |
| 2019-09-04 | 1.495 | 1.489 |
| 2019-09-05 | 1.515 | 1.472 |
| 2019-09-06 | 1.516 | 1.467 |
| 2019-09-09 | 1.516 | 1.458 |
| 2019-09-10 | 1.516 | 1.459 |
| 2019-09-11 | 1.527 | 1.473 |
| 2019-09-12 | 1.532 | 1.475 |
| 2019-09-13 | 1.531 | 1.467 |
| 2019-09-16 | 1.526 | 1.468 |
| 2019-09-17 | 1.53 | 1.481 |
| 2019-09-18 | 1.53 | 1.488 |
| 2019-09-19 | 1.53 | 1.493 |
| 2019-09-20 | 1.523 | 1.499 |
| 2019-09-23 | 1.523 | 1.501 |
| 2019-09-24 | 1.51 | 1.517 |
| 2019-09-25 | 1.519 | 1.516 |
| 2019-09-26 | 1.515 | 1.524 |
| 2019-09-27 | 1.507 | 1.518 |
| 2019-09-30 | 1.515 | 1.519 |